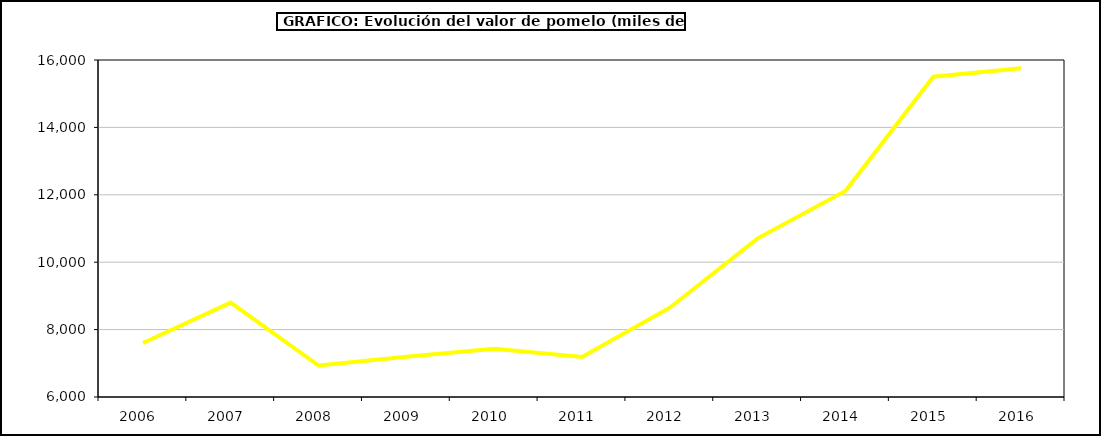
| Category | Valor |
|---|---|
| 2006.0 | 7601.593 |
| 2007.0 | 8799.68 |
| 2008.0 | 6934.237 |
| 2009.0 | 7196.478 |
| 2010.0 | 7430.969 |
| 2011.0 | 7186.419 |
| 2012.0 | 8649.711 |
| 2013.0 | 10707.894 |
| 2014.0 | 12111.902 |
| 2015.0 | 15505 |
| 2016.0 | 15755 |